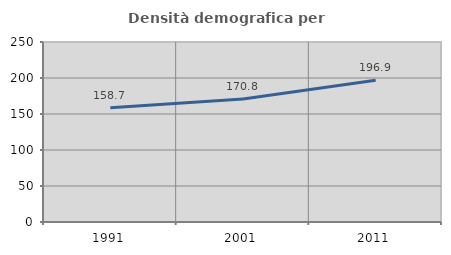
| Category | Densità demografica |
|---|---|
| 1991.0 | 158.668 |
| 2001.0 | 170.796 |
| 2011.0 | 196.917 |